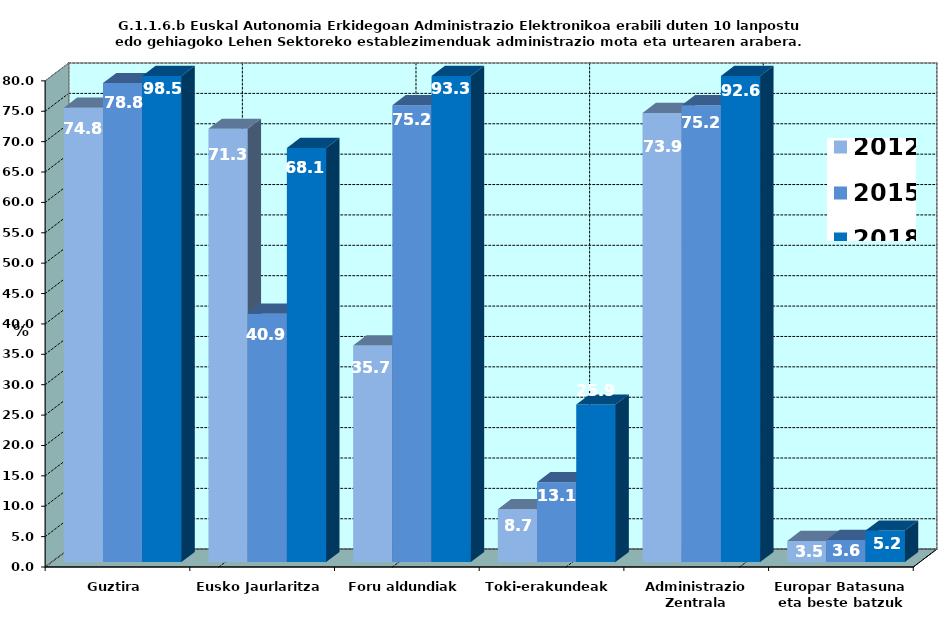
| Category | 2012 | 2015 | 2018 |
|---|---|---|---|
| Guztira | 74.783 | 78.832 | 98.519 |
| Eusko Jaurlaritza | 71.304 | 40.876 | 68.148 |
| Foru aldundiak | 35.652 | 75.182 | 93.333 |
| Toki-erakundeak | 8.696 | 13.139 | 25.926 |
| Administrazio Zentrala | 73.913 | 75.182 | 92.593 |
| Europar Batasuna eta beste batzuk | 3.478 | 3.65 | 5.185 |